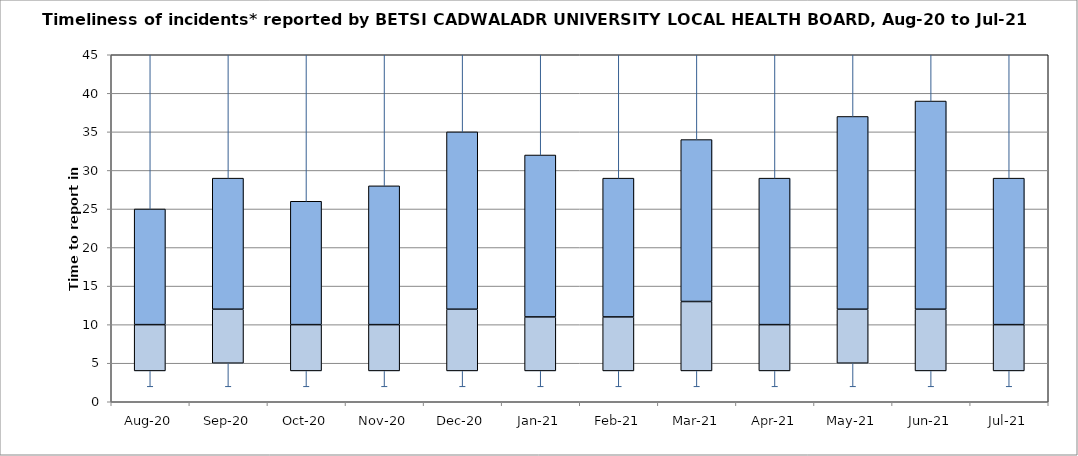
| Category | Series 0 | Series 1 | Series 2 |
|---|---|---|---|
| Aug-20 | 4 | 6 | 15 |
| Sep-20 | 5 | 7 | 17 |
| Oct-20 | 4 | 6 | 16 |
| Nov-20 | 4 | 6 | 18 |
| Dec-20 | 4 | 8 | 23 |
| Jan-21 | 4 | 7 | 21 |
| Feb-21 | 4 | 7 | 18 |
| Mar-21 | 4 | 9 | 21 |
| Apr-21 | 4 | 6 | 19 |
| May-21 | 5 | 7 | 25 |
| Jun-21 | 4 | 8 | 27 |
| Jul-21 | 4 | 6 | 19 |